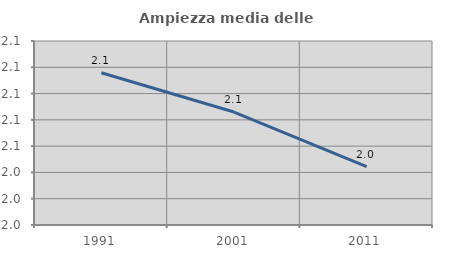
| Category | Ampiezza media delle famiglie |
|---|---|
| 1991.0 | 2.116 |
| 2001.0 | 2.086 |
| 2011.0 | 2.044 |